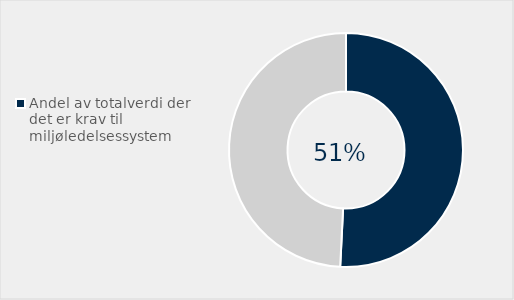
| Category | Series 0 |
|---|---|
| Andel av totalverdi der det er krav til miljøledelsessystem | 0.508 |
| Ikke brukt miljøledelsessystem | 0.492 |